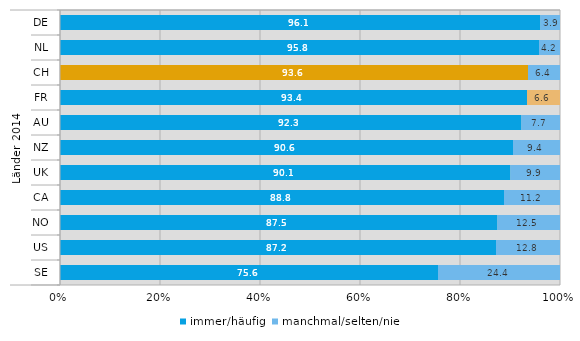
| Category | immer/häufig | manchmal/selten/nie |
|---|---|---|
| 0 | 96.1 | 3.9 |
| 1 | 95.8 | 4.2 |
| 2 | 93.6 | 6.4 |
| 3 | 93.4 | 6.6 |
| 4 | 92.3 | 7.7 |
| 5 | 90.6 | 9.4 |
| 6 | 90.1 | 9.9 |
| 7 | 88.8 | 11.2 |
| 8 | 87.5 | 12.5 |
| 9 | 87.2 | 12.8 |
| 10 | 75.6 | 24.4 |